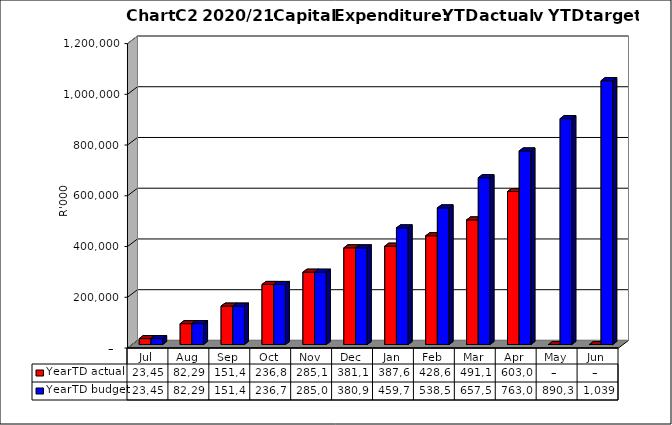
| Category | YearTD actual | YearTD budget |
|---|---|---|
| Jul | 23449713.35 | 23449713.353 |
| Aug | 82290541.22 | 82290541.222 |
| Sep | 151417435.55 | 151417435.557 |
| Oct | 236843117.22 | 236732057.814 |
| Nov | 285135887.03 | 285024827.634 |
| Dec | 381114526.333 | 380978741.757 |
| Jan | 387685296.19 | 459759496.134 |
| Feb | 428653989.22 | 538540239.449 |
| Mar | 491131115.022 | 657535142.431 |
| Apr | 603015639.257 | 763074825.564 |
| May | 0 | 890305443.132 |
| Jun | 0 | 1039881030.361 |